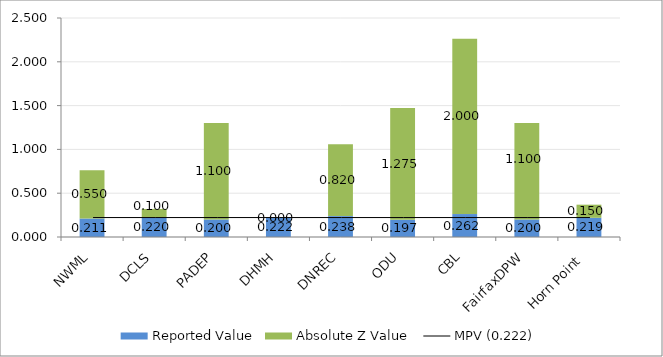
| Category | Reported Value | Absolute Z Value  |
|---|---|---|
| NWML | 0.211 | 0.55 |
| DCLS | 0.22 | 0.1 |
| PADEP | 0.2 | 1.1 |
| DHMH | 0.222 | 0 |
| DNREC | 0.238 | 0.82 |
| ODU | 0.196 | 1.275 |
| CBL | 0.262 | 2 |
| FairfaxDPW | 0.2 | 1.1 |
| Horn Point  | 0.219 | 0.15 |